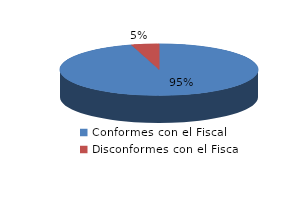
| Category | Series 0 |
|---|---|
| 0 | 1164 |
| 1 | 55 |